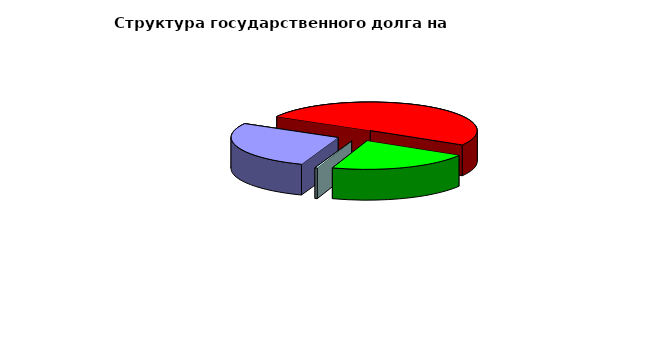
| Category | Series 0 |
|---|---|
| Договоры и соглашения о получении бюджетных кредитов от бюджетов других уровней бюджетной системы  | 20959084.963 |
| Государственные займы, осуществляемые путем выпуска ценных бумаг  | 38300000 |
| Кредитные соглашения и договоры | 16500000 |
| Договоры о предоставлении государственных гарантий | 262100.52 |